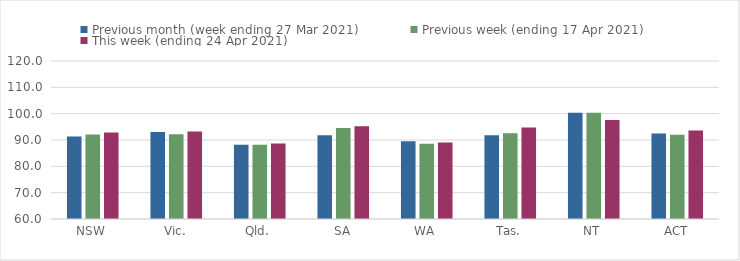
| Category | Previous month (week ending 27 Mar 2021) | Previous week (ending 17 Apr 2021) | This week (ending 24 Apr 2021) |
|---|---|---|---|
| NSW | 91.36 | 92.08 | 92.83 |
| Vic. | 93.06 | 92.17 | 93.23 |
| Qld. | 88.21 | 88.15 | 88.69 |
| SA | 91.83 | 94.58 | 95.23 |
| WA | 89.55 | 88.53 | 89.05 |
| Tas. | 91.83 | 92.55 | 94.77 |
| NT | 100.33 | 100.33 | 97.59 |
| ACT | 92.47 | 92.03 | 93.58 |